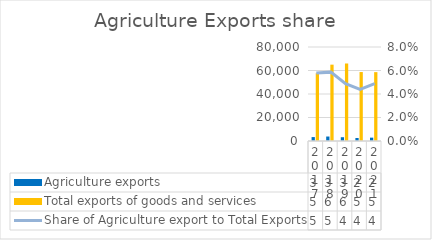
| Category | Agriculture exports | Total exports of goods and services |
|---|---|---|
| 2017 | 3332.445 | 57683.219 |
| 2018 | 3807.32 | 64971.502 |
| 2019 | 3214.017 | 65962.327 |
| 2020 | 2574.242 | 58681.356 |
| 2021 | 2860.028 | 58598.741 |